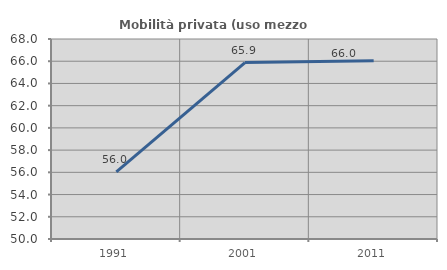
| Category | Mobilità privata (uso mezzo privato) |
|---|---|
| 1991.0 | 56.046 |
| 2001.0 | 65.881 |
| 2011.0 | 66.045 |